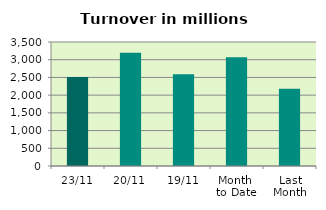
| Category | Series 0 |
|---|---|
| 23/11 | 2509.617 |
| 20/11 | 3198.619 |
| 19/11 | 2592.831 |
| Month 
to Date | 3068.65 |
| Last
Month | 2179.795 |